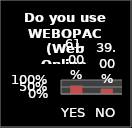
| Category | Series 0 |
|---|---|
| YES | 0.61 |
| NO | 0.39 |